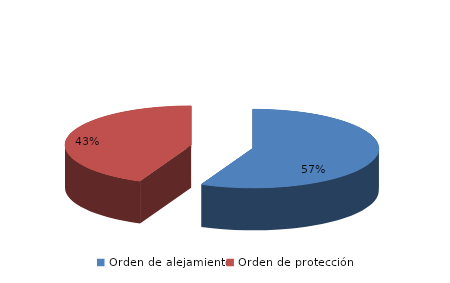
| Category | Series 0 |
|---|---|
| Orden de alejamiento | 64 |
| Orden de protección | 49 |